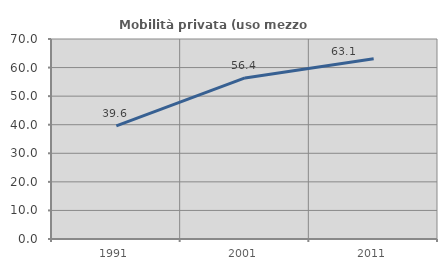
| Category | Mobilità privata (uso mezzo privato) |
|---|---|
| 1991.0 | 39.561 |
| 2001.0 | 56.366 |
| 2011.0 | 63.115 |